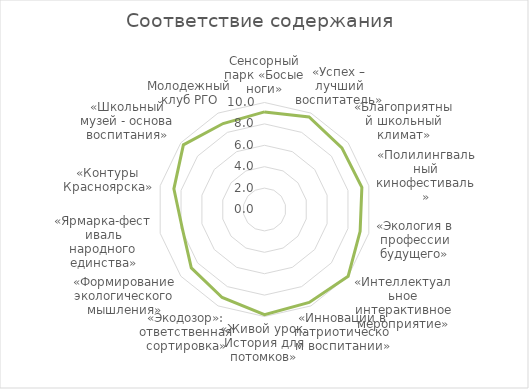
| Category | Series 2 |
|---|---|
| Сенсорный парк «Босые ноги» | 9.12 |
| «Успех – лучший воспитатель» | 9.6 |
| «Благоприятный школьный климат» | 9.25 |
| «Полилингвальный кинофестиваль» | 9.333 |
| «Экология в профессии будущего» | 9.167 |
| «Интеллектуальное интерактивное мероприятие» | 10 |
| «Инновации в патриотическом воспитании» | 9.636 |
| «Живой урок. История для потомков» | 9.833 |
| «Экодозор»: ответственная сортировка» | 9.125 |
| «Формирование экологического мышления» | 8.75 |
| «Ярмарка-фестиваль народного единства» | 7.882 |
| «Контуры Красноярска» | 8.688 |
| «Школьный музей - основа воспитания» | 9.696 |
| Молодежный клуб РГО | 8.917 |